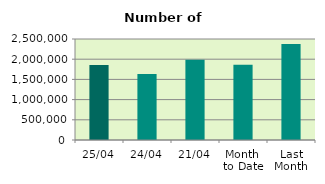
| Category | Series 0 |
|---|---|
| 25/04 | 1854796 |
| 24/04 | 1632492 |
| 21/04 | 1986612 |
| Month 
to Date | 1862327.2 |
| Last
Month | 2375448 |